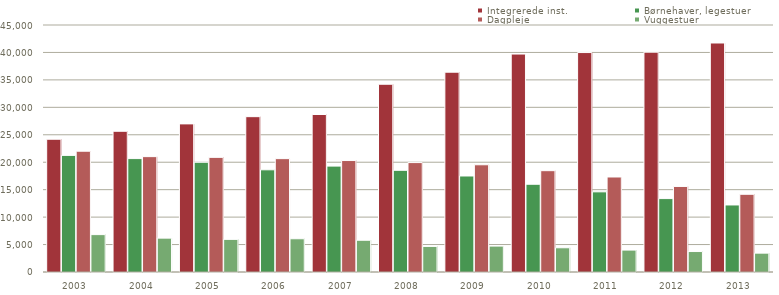
| Category | Integrerede inst. | Børnehaver, legestuer   | Dagpleje | Vuggestuer  |
|---|---|---|---|---|
| 2003.0 | 24186 | 21246 | 22006 | 6811 |
| 2004.0 | 25638 | 20663 | 21018 | 6169 |
| 2005.0 | 26984 | 19994 | 20885 | 5943 |
| 2006.0 | 28300 | 18618 | 20652 | 6057 |
| 2007.0 | 28692 | 19290 | 20308 | 5784 |
| 2008.0 | 34207 | 18526 | 19934 | 4661 |
| 2009.0 | 36403 | 17491 | 19534 | 4724 |
| 2010.0 | 39708 | 15986 | 18458 | 4415 |
| 2011.0 | 39980 | 14605 | 17310 | 3994 |
| 2012.0 | 40049 | 13376 | 15587 | 3727 |
| 2013.0 | 41722 | 12214 | 14157 | 3435 |